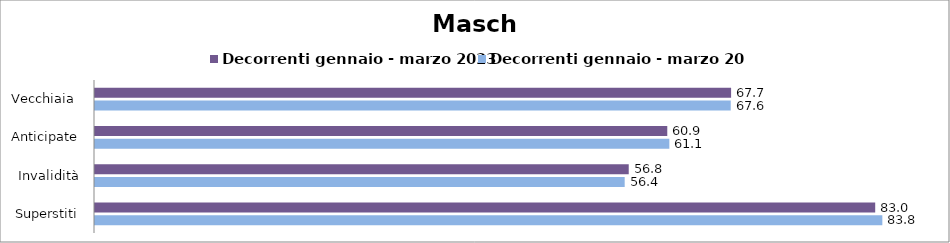
| Category | Decorrenti gennaio - marzo 2023 | Decorrenti gennaio - marzo 2024 |
|---|---|---|
| Vecchiaia  | 67.67 | 67.63 |
| Anticipate | 60.88 | 61.1 |
| Invalidità | 56.78 | 56.35 |
| Superstiti | 83 | 83.76 |